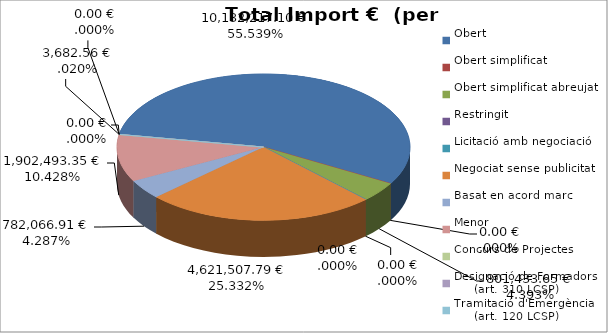
| Category | Total preu
(amb IVA) |
|---|---|
| Obert | 10132217.1 |
| Obert simplificat | 0 |
| Obert simplificat abreujat | 801433.648 |
| Restringit | 0 |
| Licitació amb negociació | 0 |
| Negociat sense publicitat | 4621507.79 |
| Basat en acord marc | 782066.91 |
| Menor | 1902493.352 |
| Concurs de Projectes | 0 |
| Designació de Formadors
     (art. 310 LCSP) | 3682.56 |
| Tramitació d'Emergència
     (art. 120 LCSP) | 0 |